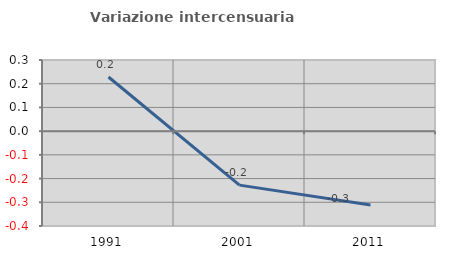
| Category | Variazione intercensuaria annua |
|---|---|
| 1991.0 | 0.228 |
| 2001.0 | -0.228 |
| 2011.0 | -0.312 |